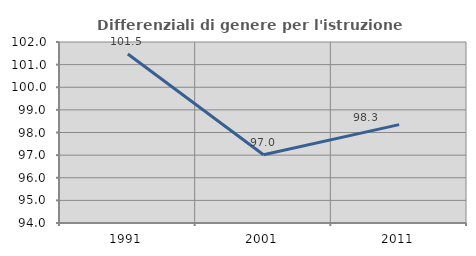
| Category | Differenziali di genere per l'istruzione superiore |
|---|---|
| 1991.0 | 101.47 |
| 2001.0 | 97.016 |
| 2011.0 | 98.347 |